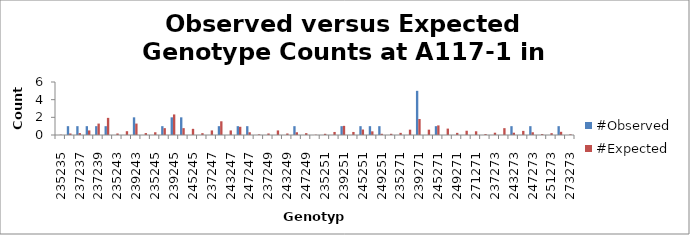
| Category | #Observed | #Expected |
|---|---|---|
| 235235.0 | 0 | 0.034 |
| 235237.0 | 1 | 0.172 |
| 237237.0 | 1 | 0.216 |
| 235239.0 | 1 | 0.517 |
| 237239.0 | 1 | 1.293 |
| 239239.0 | 1 | 1.94 |
| 235243.0 | 0 | 0.172 |
| 237243.0 | 0 | 0.431 |
| 239243.0 | 2 | 1.293 |
| 243243.0 | 0 | 0.216 |
| 235245.0 | 0 | 0.31 |
| 237245.0 | 1 | 0.776 |
| 239245.0 | 2 | 2.328 |
| 243245.0 | 2 | 0.776 |
| 245245.0 | 0 | 0.698 |
| 235247.0 | 0 | 0.207 |
| 237247.0 | 0 | 0.517 |
| 239247.0 | 1 | 1.552 |
| 243247.0 | 0 | 0.517 |
| 245247.0 | 1 | 0.931 |
| 247247.0 | 1 | 0.31 |
| 235249.0 | 0 | 0.069 |
| 237249.0 | 0 | 0.172 |
| 239249.0 | 0 | 0.517 |
| 243249.0 | 0 | 0.172 |
| 245249.0 | 1 | 0.31 |
| 247249.0 | 0 | 0.207 |
| 249249.0 | 0 | 0.034 |
| 235251.0 | 0 | 0.138 |
| 237251.0 | 0 | 0.345 |
| 239251.0 | 1 | 1.034 |
| 243251.0 | 0 | 0.345 |
| 245251.0 | 1 | 0.621 |
| 247251.0 | 1 | 0.414 |
| 249251.0 | 1 | 0.138 |
| 251251.0 | 0 | 0.138 |
| 235271.0 | 0 | 0.241 |
| 237271.0 | 0 | 0.603 |
| 239271.0 | 5 | 1.81 |
| 243271.0 | 0 | 0.603 |
| 245271.0 | 1 | 1.086 |
| 247271.0 | 0 | 0.724 |
| 249271.0 | 0 | 0.241 |
| 251271.0 | 0 | 0.483 |
| 271271.0 | 0 | 0.422 |
| 235273.0 | 0 | 0.103 |
| 237273.0 | 0 | 0.259 |
| 239273.0 | 0 | 0.776 |
| 243273.0 | 1 | 0.259 |
| 245273.0 | 0 | 0.466 |
| 247273.0 | 1 | 0.31 |
| 249273.0 | 0 | 0.103 |
| 251273.0 | 0 | 0.207 |
| 271273.0 | 1 | 0.362 |
| 273273.0 | 0 | 0.078 |